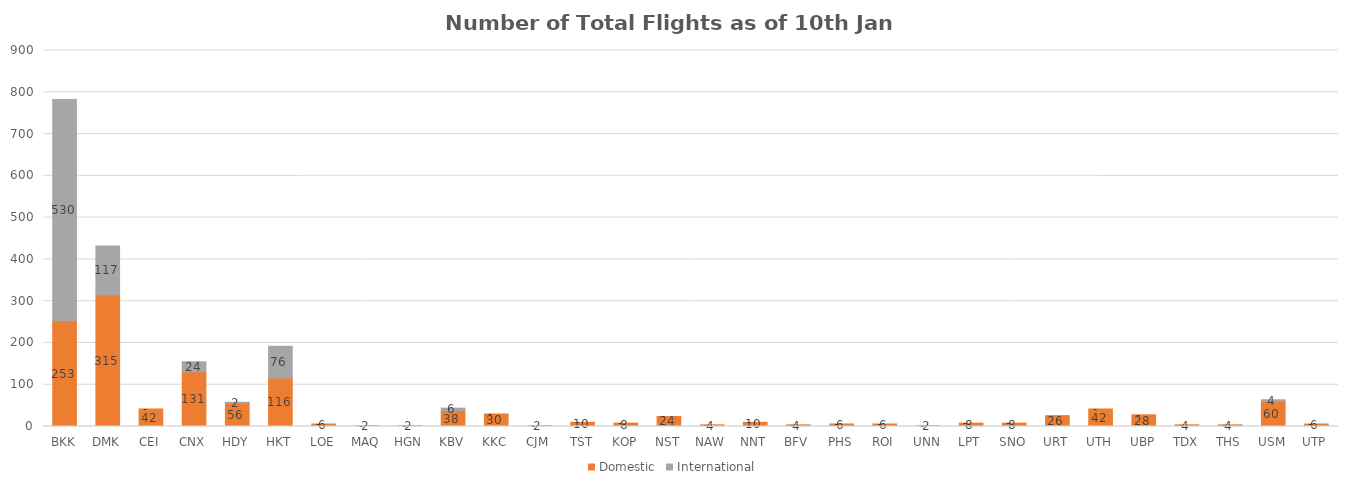
| Category | Domestic | International |
|---|---|---|
| BKK | 253 | 530 |
| DMK | 315 | 117 |
| CEI | 42 | 0 |
| CNX | 131 | 24 |
| HDY | 56 | 2 |
| HKT | 116 | 76 |
| LOE | 6 | 0 |
| MAQ | 2 | 0 |
| HGN | 2 | 0 |
| KBV | 38 | 6 |
| KKC | 30 | 0 |
| CJM | 2 | 0 |
| TST | 10 | 0 |
| KOP | 8 | 0 |
| NST | 24 | 0 |
| NAW | 4 | 0 |
| NNT | 10 | 0 |
| BFV | 4 | 0 |
| PHS | 6 | 0 |
| ROI | 6 | 0 |
| UNN | 2 | 0 |
| LPT | 8 | 0 |
| SNO | 8 | 0 |
| URT | 26 | 0 |
| UTH | 42 | 0 |
| UBP | 28 | 0 |
| TDX | 4 | 0 |
| THS | 4 | 0 |
| USM | 60 | 4 |
| UTP | 6 | 0 |